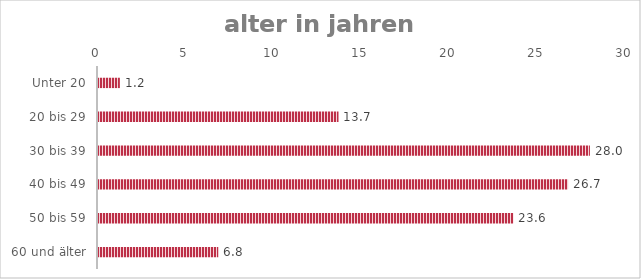
| Category | Gültige Prozente |
|---|---|
| Unter 20 | 1.242 |
| 20 bis 29 | 13.665 |
| 30 bis 39 | 27.95 |
| 40 bis 49 | 26.708 |
| 50 bis 59 | 23.602 |
| 60 und älter | 6.832 |